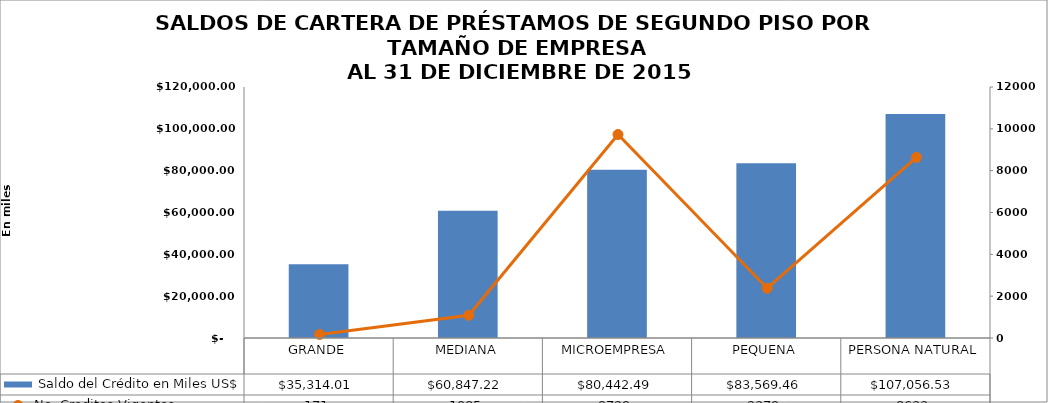
| Category |  Saldo del Crédito en Miles US$ |
|---|---|
| GRANDE | 35314.006 |
| MEDIANA | 60847.22 |
| MICROEMPRESA | 80442.49 |
| PEQUENA | 83569.46 |
| PERSONA NATURAL | 107056.535 |